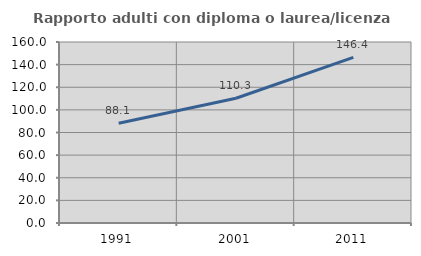
| Category | Rapporto adulti con diploma o laurea/licenza media  |
|---|---|
| 1991.0 | 88.102 |
| 2001.0 | 110.258 |
| 2011.0 | 146.426 |